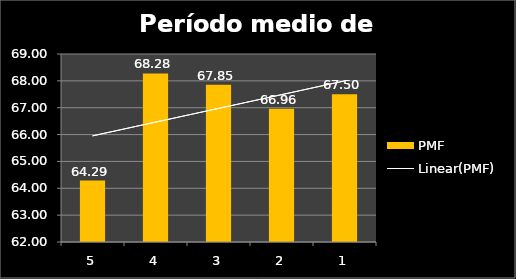
| Category | PMF |
|---|---|
| 5.0 | 64.286 |
| 4.0 | 68.276 |
| 3.0 | 67.851 |
| 2.0 | 66.96 |
| 1.0 | 67.5 |